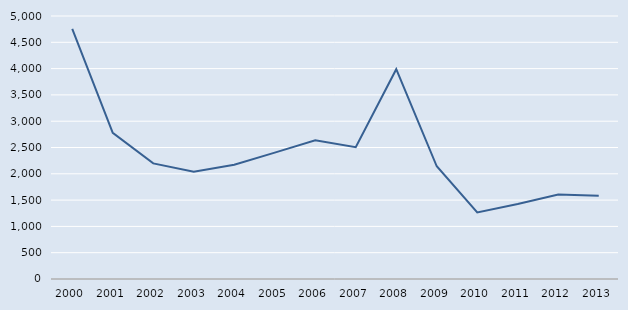
| Category | Series 0 |
|---|---|
| 2000.0 | 4756 |
| 2001.0 | 2780 |
| 2002.0 | 2198 |
| 2003.0 | 2037 |
| 2004.0 | 2173 |
| 2005.0 | 2403 |
| 2006.0 | 2638 |
| 2007.0 | 2506 |
| 2008.0 | 3988 |
| 2009.0 | 2143 |
| 2010.0 | 1266 |
| 2011.0 | 1426 |
| 2012.0 | 1607 |
| 2013.0 | 1585 |